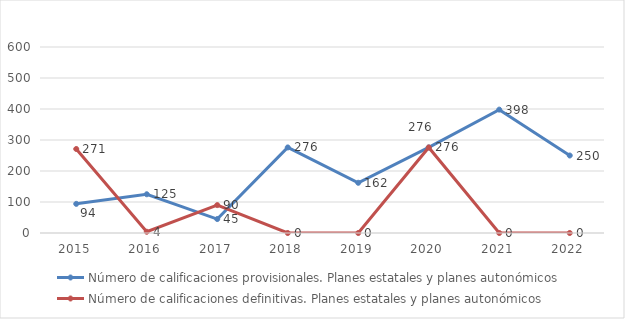
| Category | Número de calificaciones provisionales. Planes estatales y planes autonómicos | Número de calificaciones definitivas. Planes estatales y planes autonómicos |
|---|---|---|
| 2015.0 | 94 | 271 |
| 2016.0 | 125 | 4 |
| 2017.0 | 45 | 90 |
| 2018.0 | 276 | 0 |
| 2019.0 | 162 | 0 |
| 2020.0 | 276 | 276 |
| 2021.0 | 398 | 0 |
| 2022.0 | 250 | 0 |